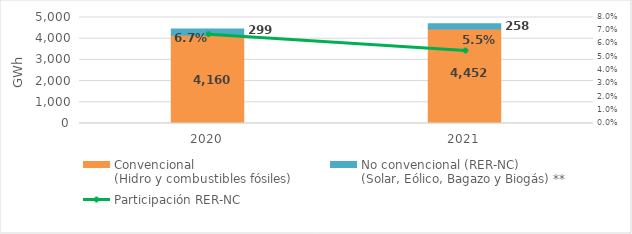
| Category | Convencional
(Hidro y combustibles fósiles) | No convencional (RER-NC)
(Solar, Eólico, Bagazo y Biogás) ** |
|---|---|---|
| 2020.0 | 4160.02 | 298.829 |
| 2021.0 | 4452.453 | 257.691 |